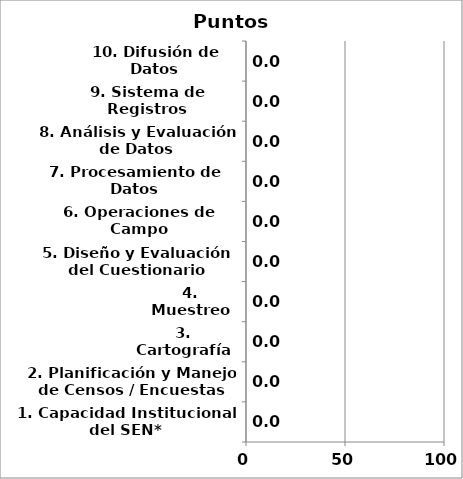
| Category | Series 0 |
|---|---|
| 1. Capacidad Institucional del SEN* | 0 |
| 2. Planificación y Manejo de Censos / Encuestas | 0 |
| 3. Cartografía | 0 |
| 4. Muestreo | 0 |
| 5. Diseño y Evaluación del Cuestionario | 0 |
| 6. Operaciones de Campo | 0 |
| 7. Procesamiento de Datos | 0 |
| 8. Análisis y Evaluación de Datos | 0 |
| 9. Sistema de Registros Administrativos | 0 |
| 10. Difusión de Datos | 0 |